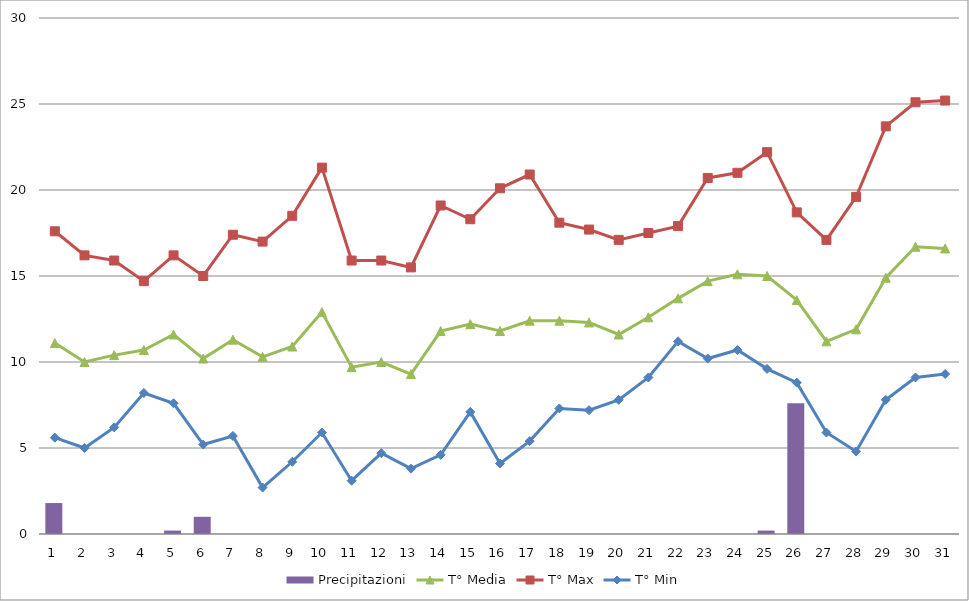
| Category | Precipitazioni |
|---|---|
| 0 | 1.8 |
| 1 | 0 |
| 2 | 0 |
| 3 | 0 |
| 4 | 0.2 |
| 5 | 1 |
| 6 | 0 |
| 7 | 0 |
| 8 | 0 |
| 9 | 0 |
| 10 | 0 |
| 11 | 0 |
| 12 | 0 |
| 13 | 0 |
| 14 | 0 |
| 15 | 0 |
| 16 | 0 |
| 17 | 0 |
| 18 | 0 |
| 19 | 0 |
| 20 | 0 |
| 21 | 0 |
| 22 | 0 |
| 23 | 0 |
| 24 | 0.2 |
| 25 | 7.6 |
| 26 | 0 |
| 27 | 0 |
| 28 | 0 |
| 29 | 0 |
| 30 | 0 |